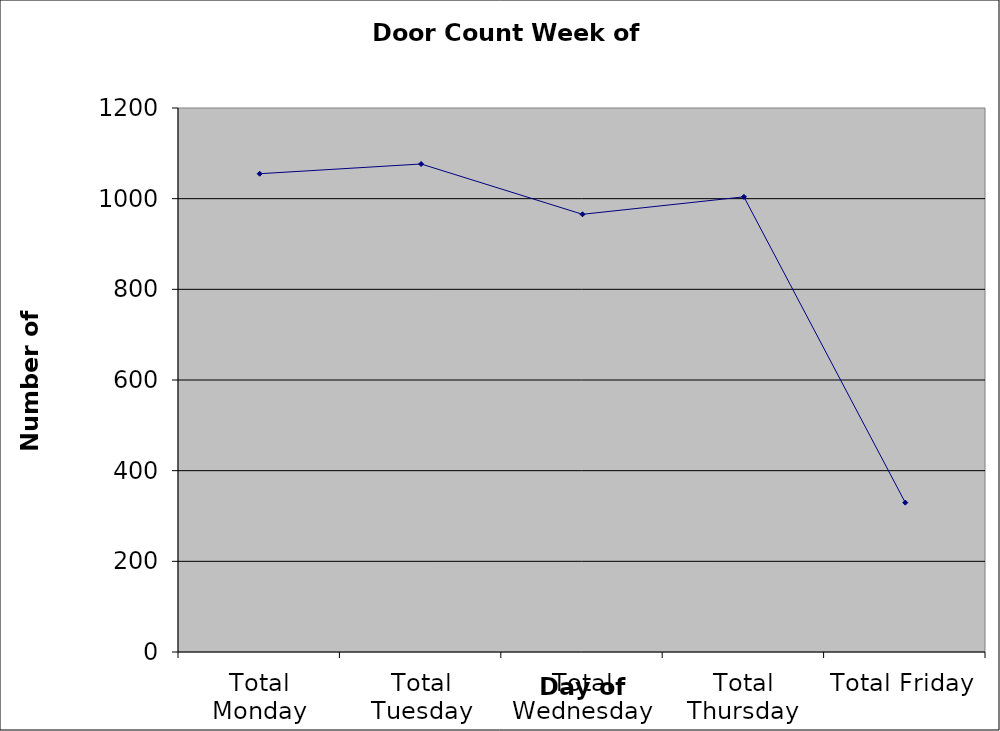
| Category | Series 0 |
|---|---|
| Total Monday | 1055 |
| Total Tuesday | 1076.5 |
| Total Wednesday | 965.5 |
| Total Thursday | 1004 |
| Total Friday | 329.5 |